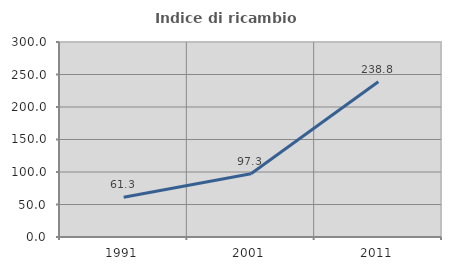
| Category | Indice di ricambio occupazionale  |
|---|---|
| 1991.0 | 61.302 |
| 2001.0 | 97.314 |
| 2011.0 | 238.81 |